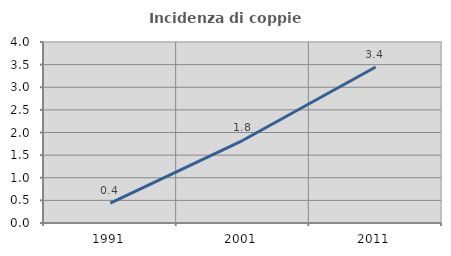
| Category | Incidenza di coppie miste |
|---|---|
| 1991.0 | 0.437 |
| 2001.0 | 1.828 |
| 2011.0 | 3.448 |